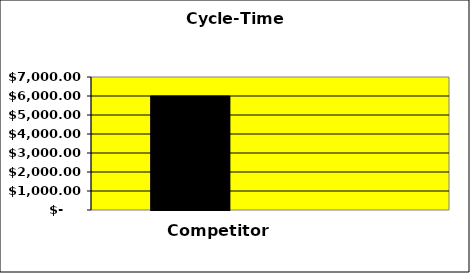
| Category | Series 0 | Series 1 | Series 2 |
|---|---|---|---|
| 0 | 6000 |  | 0 |